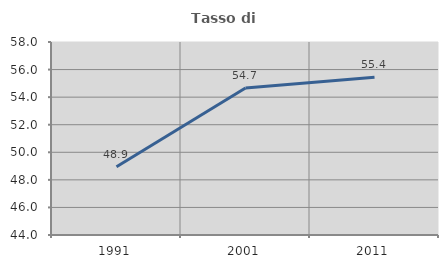
| Category | Tasso di occupazione   |
|---|---|
| 1991.0 | 48.945 |
| 2001.0 | 54.669 |
| 2011.0 | 55.445 |